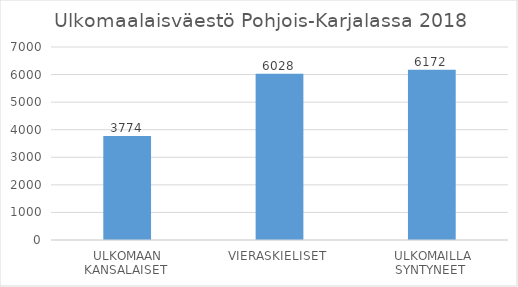
| Category | Pohjois-Karjala |
|---|---|
| ULKOMAAN KANSALAISET  | 3774 |
| VIERASKIELISET  | 6028 |
| ULKOMAILLA SYNTYNEET  | 6172 |